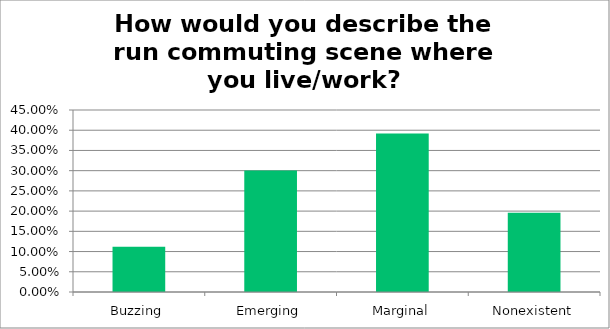
| Category | Responses |
|---|---|
| Buzzing | 0.112 |
| Emerging | 0.301 |
| Marginal | 0.392 |
| Nonexistent | 0.196 |